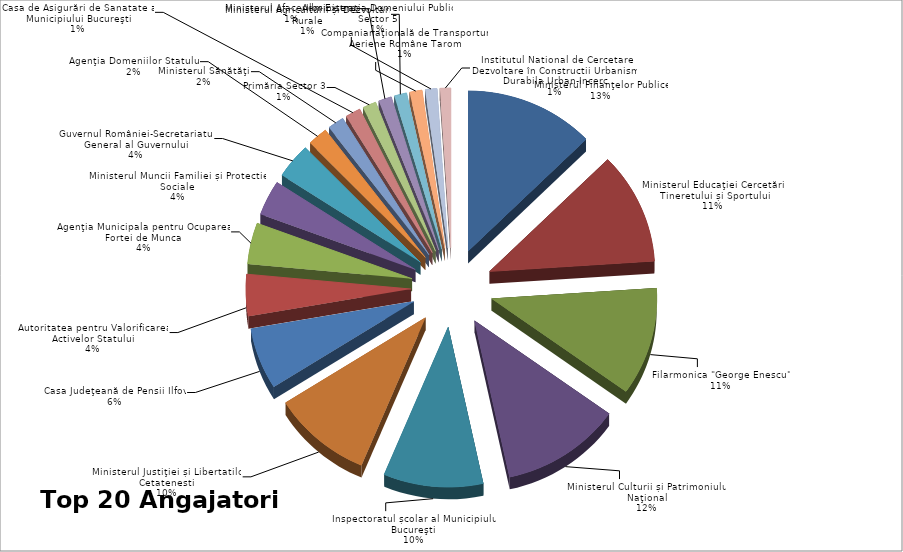
| Category | Series 0 |
|---|---|
| Ministerul Finanţelor Publice | 229 |
| Ministerul Educaţiei Cercetării Tineretului și Sportului | 204 |
| Filarmonica "George Enescu" | 197 |
| Ministerul Culturii și Patrimoniului Naţional | 212 |
| Inspectoratul școlar al Municipiului Bucureşti | 176 |
| Ministerul Justiţiei și Libertatilor Cetatenesti | 176 |
| Casa Judeţeană de Pensii Ilfov | 112 |
| Autoritatea pentru Valorificarea Activelor Statului | 76 |
| Agenţia Municipala pentru Ocuparea Fortei de Munca | 75 |
| Ministerul Muncii Familiei și Protectiei Sociale | 64 |
| Guvernul României-Secretariatul General al Guvernului | 64 |
| Agenţia Domeniilor Statului | 35 |
| Ministerul Sănătăţii | 29 |
| Casa de Asigurări de Sanatate a Municipiului Bucureşti | 27 |
| Primăria Sector 3 | 24 |
| Ministerul Afacerilor Externe | 23 |
| Ministerul Agriculturii și Dezvoltării Rurale | 22 |
| Companianaţională de Transporturi Aeriene Române Tarom | 22 |
| Administraţia Domeniului Public Sector 5 | 21 |
| Institutul National de Cercetare Dezvoltare în Constructii Urbanism Durabila Urban-Incerc | 19 |